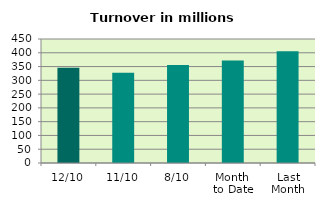
| Category | Series 0 |
|---|---|
| 12/10 | 345.365 |
| 11/10 | 327.249 |
| 8/10 | 355.815 |
| Month 
to Date | 372.349 |
| Last
Month | 405.806 |